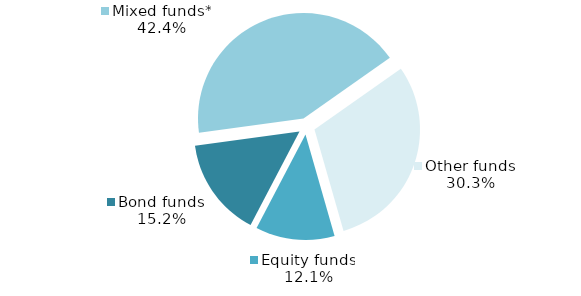
| Category | Series 0 |
|---|---|
| Equity funds | 4 |
| Bond funds | 5 |
| Mixed funds* | 14 |
| Other funds | 10 |